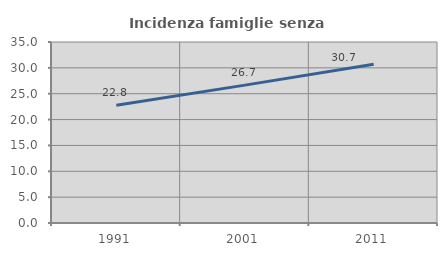
| Category | Incidenza famiglie senza nuclei |
|---|---|
| 1991.0 | 22.751 |
| 2001.0 | 26.662 |
| 2011.0 | 30.693 |